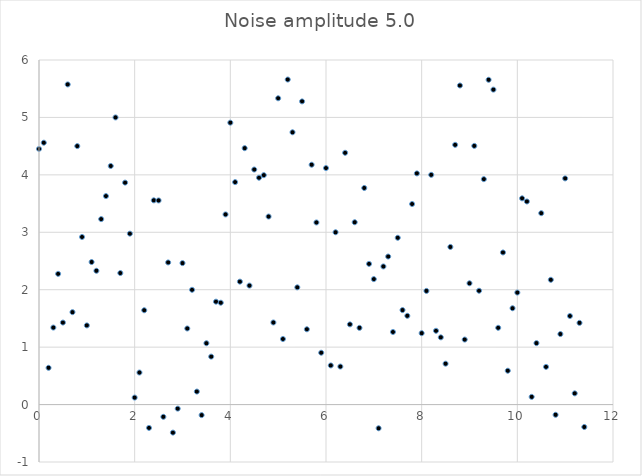
| Category | Series 0 |
|---|---|
| 0.0 | 4.452 |
| 0.1 | 4.56 |
| 0.2 | 0.64 |
| 0.3 | 1.341 |
| 0.4 | 2.276 |
| 0.5 | 1.428 |
| 0.6 | 5.575 |
| 0.7 | 1.609 |
| 0.8 | 4.501 |
| 0.9 | 2.918 |
| 1.0 | 1.378 |
| 1.1 | 2.482 |
| 1.2 | 2.33 |
| 1.3 | 3.23 |
| 1.4 | 3.631 |
| 1.5 | 4.154 |
| 1.6 | 5 |
| 1.7 | 2.29 |
| 1.8 | 3.865 |
| 1.900000000000001 | 2.976 |
| 2.0 | 0.122 |
| 2.100000000000001 | 0.558 |
| 2.200000000000001 | 1.642 |
| 2.300000000000001 | -0.406 |
| 2.400000000000001 | 3.556 |
| 2.500000000000001 | 3.554 |
| 2.600000000000001 | -0.213 |
| 2.700000000000001 | 2.475 |
| 2.800000000000001 | -0.489 |
| 2.900000000000001 | -0.071 |
| 3.000000000000001 | 2.463 |
| 3.100000000000001 | 1.325 |
| 3.200000000000001 | 1.998 |
| 3.300000000000002 | 0.227 |
| 3.400000000000002 | -0.184 |
| 3.500000000000002 | 1.068 |
| 3.600000000000002 | 0.835 |
| 3.700000000000002 | 1.792 |
| 3.800000000000002 | 1.774 |
| 3.900000000000002 | 3.311 |
| 4.000000000000002 | 4.909 |
| 4.100000000000001 | 3.874 |
| 4.200000000000001 | 2.141 |
| 4.300000000000001 | 4.465 |
| 4.4 | 2.072 |
| 4.5 | 4.093 |
| 4.6 | 3.95 |
| 4.699999999999999 | 3.995 |
| 4.799999999999999 | 3.274 |
| 4.899999999999999 | 1.429 |
| 4.999999999999998 | 5.334 |
| 5.099999999999998 | 1.142 |
| 5.199999999999997 | 5.66 |
| 5.299999999999997 | 4.742 |
| 5.399999999999997 | 2.041 |
| 5.499999999999996 | 5.279 |
| 5.599999999999996 | 1.311 |
| 5.699999999999996 | 4.176 |
| 5.799999999999995 | 3.171 |
| 5.899999999999995 | 0.903 |
| 5.999999999999994 | 4.118 |
| 6.099999999999994 | 0.681 |
| 6.199999999999994 | 3.001 |
| 6.299999999999994 | 0.662 |
| 6.399999999999993 | 4.384 |
| 6.499999999999993 | 1.396 |
| 6.599999999999993 | 3.175 |
| 6.699999999999992 | 1.336 |
| 6.799999999999992 | 3.772 |
| 6.899999999999991 | 2.45 |
| 6.999999999999991 | 2.185 |
| 7.099999999999991 | -0.412 |
| 7.19999999999999 | 2.405 |
| 7.29999999999999 | 2.578 |
| 7.39999999999999 | 1.264 |
| 7.49999999999999 | 2.904 |
| 7.599999999999989 | 1.646 |
| 7.699999999999989 | 1.546 |
| 7.799999999999988 | 3.492 |
| 7.899999999999988 | 4.025 |
| 7.999999999999987 | 1.244 |
| 8.099999999999987 | 1.979 |
| 8.199999999999987 | 4 |
| 8.299999999999986 | 1.285 |
| 8.399999999999986 | 1.171 |
| 8.499999999999986 | 0.712 |
| 8.599999999999985 | 2.745 |
| 8.699999999999983 | 4.523 |
| 8.799999999999985 | 5.556 |
| 8.899999999999984 | 1.132 |
| 8.999999999999982 | 2.112 |
| 9.099999999999984 | 4.504 |
| 9.199999999999983 | 1.982 |
| 9.299999999999981 | 3.925 |
| 9.39999999999998 | 5.655 |
| 9.49999999999998 | 5.484 |
| 9.59999999999998 | 1.337 |
| 9.69999999999998 | 2.649 |
| 9.79999999999998 | 0.589 |
| 9.89999999999998 | 1.677 |
| 9.99999999999998 | 1.95 |
| 10.09999999999998 | 3.591 |
| 10.19999999999998 | 3.536 |
| 10.29999999999998 | 0.134 |
| 10.39999999999998 | 1.07 |
| 10.49999999999998 | 3.333 |
| 10.59999999999998 | 0.656 |
| 10.69999999999998 | 2.173 |
| 10.79999999999998 | -0.178 |
| 10.89999999999998 | 1.228 |
| 10.99999999999998 | 3.938 |
| 11.09999999999998 | 1.542 |
| 11.19999999999998 | 0.195 |
| 11.29999999999998 | 1.423 |
| 11.39999999999998 | -0.39 |